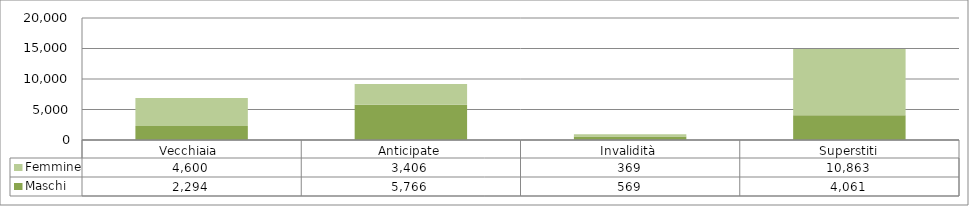
| Category | Maschi | Femmine |
|---|---|---|
| Vecchiaia  | 2294 | 4600 |
| Anticipate | 5766 | 3406 |
| Invalidità | 569 | 369 |
| Superstiti | 4061 | 10863 |